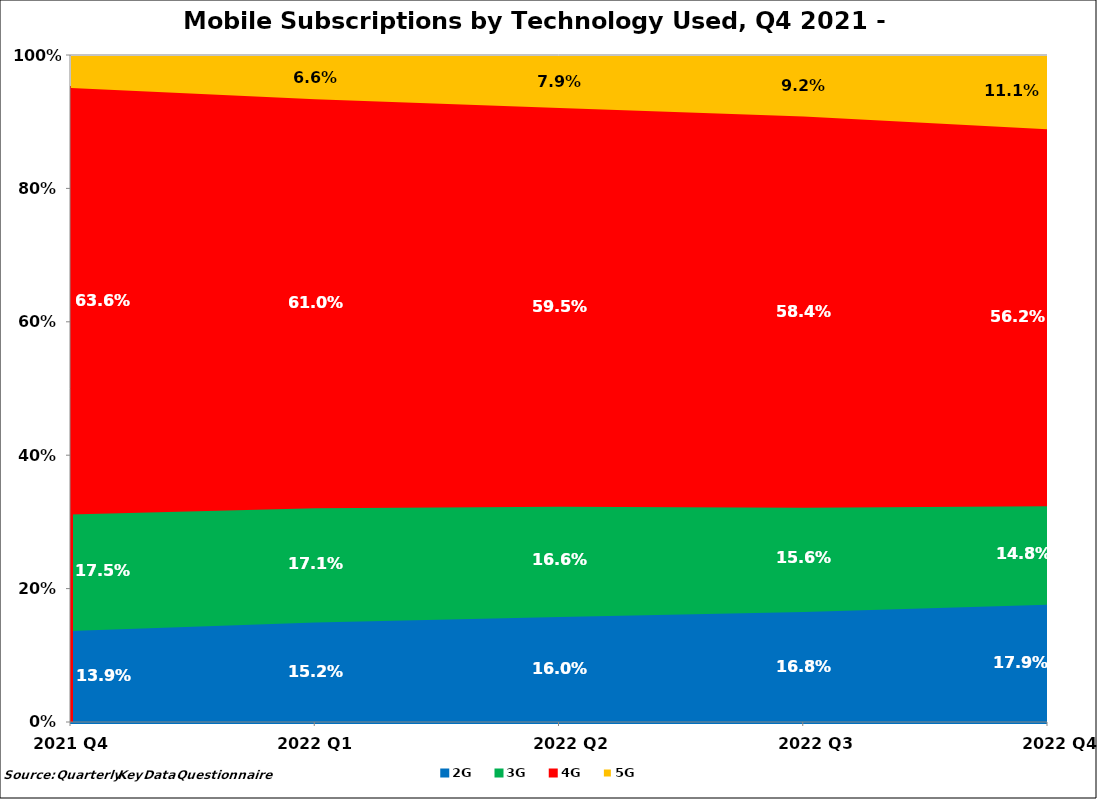
| Category | 2G | 3G | 4G | 5G |
|---|---|---|---|---|
| 2021 Q4  | 0.139 | 0.175 | 0.636 | 0.05 |
| 2022 Q1  | 0.152 | 0.171 | 0.61 | 0.066 |
| 2022 Q2 | 0.16 | 0.166 | 0.595 | 0.079 |
| 2022 Q3 | 0.168 | 0.156 | 0.584 | 0.092 |
| 2022 Q4 | 0.179 | 0.148 | 0.562 | 0.111 |